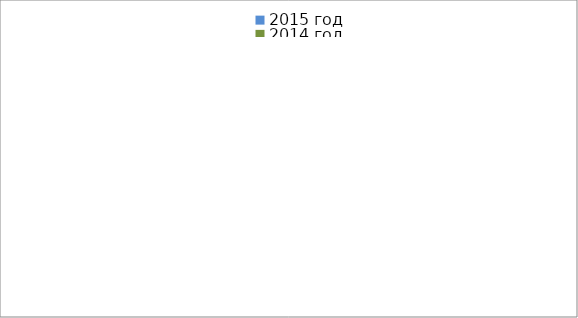
| Category | 2015 год | 2014 год |
|---|---|---|
|  - поджог | 30 | 26 |
|  - неосторожное обращение с огнём | 64 | 46 |
|  - НПТЭ электрооборудования | 10 | 21 |
|  - НПУ и Э печей | 71 | 76 |
|  - НПУ и Э транспортных средств | 49 | 72 |
|   -Шалость с огнем детей | 3 | 1 |
|  -НППБ при эксплуатации эл.приборов | 14 | 21 |
|  - курение | 27 | 22 |
| - прочие | 115 | 115 |
| - не установленные причины | 17 | 10 |